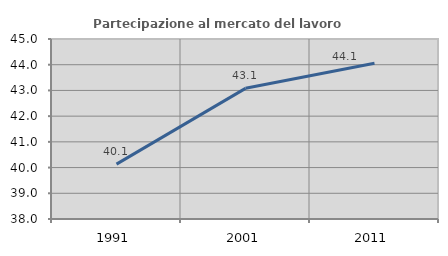
| Category | Partecipazione al mercato del lavoro  femminile |
|---|---|
| 1991.0 | 40.136 |
| 2001.0 | 43.081 |
| 2011.0 | 44.057 |